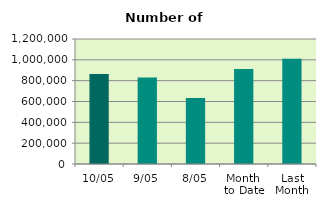
| Category | Series 0 |
|---|---|
| 10/05 | 864808 |
| 9/05 | 831432 |
| 8/05 | 633830 |
| Month 
to Date | 912664.286 |
| Last
Month | 1010681.333 |